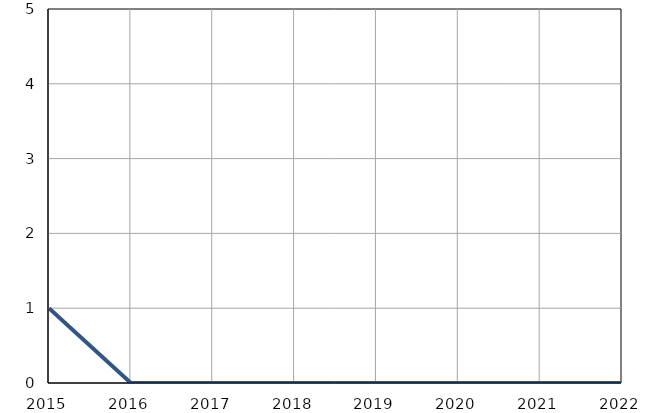
| Category | Умрла 
одојчад |
|---|---|
| 2015.0 | 1 |
| 2016.0 | 0 |
| 2017.0 | 0 |
| 2018.0 | 0 |
| 2019.0 | 0 |
| 2020.0 | 0 |
| 2021.0 | 0 |
| 2022.0 | 0 |